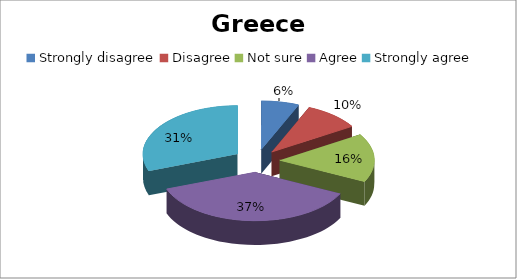
| Category | Series 0 |
|---|---|
| Strongly disagree | 4 |
| Disagree | 6 |
| Not sure | 10 |
| Agree | 23 |
| Strongly agree | 19 |